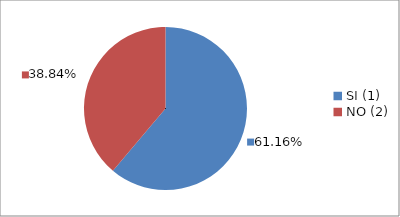
| Category | Series 0 |
|---|---|
| SI (1) | 0.612 |
| NO (2) | 0.388 |